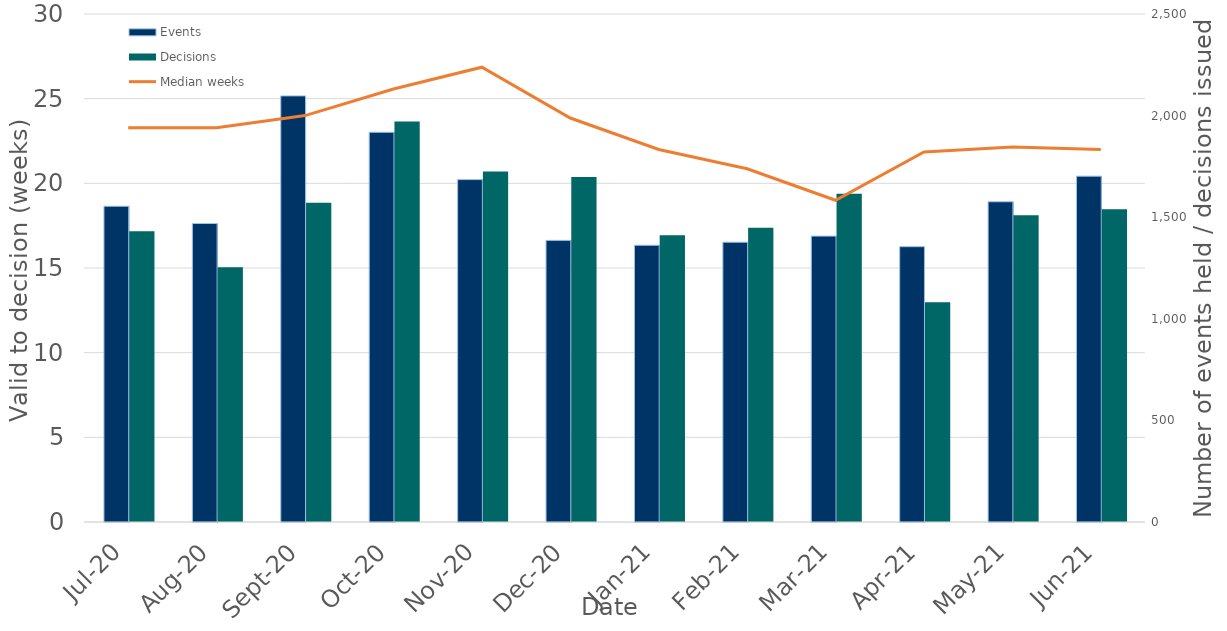
| Category | Events | Decisions |
|---|---|---|
| 0 | 1554 | 1431 |
| 1900-01-01 | 1469 | 1254 |
| 1900-01-02 | 2097 | 1571 |
| 1900-01-03 | 1918 | 1971 |
| 1900-01-04 | 1685 | 1725 |
| 1900-01-05 | 1386 | 1698 |
| 1900-01-06 | 1362 | 1411 |
| 1900-01-07 | 1377 | 1448 |
| 1900-01-08 | 1407 | 1615 |
| 1900-01-09 | 1355 | 1081 |
| 1900-01-10 | 1576 | 1510 |
| 1900-01-11 | 1702 | 1539 |